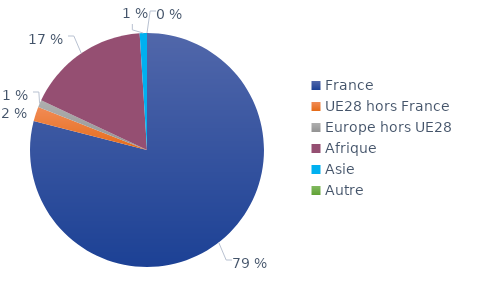
| Category | Series 0 |
|---|---|
| France | 0.79 |
| UE28 hors France | 0.02 |
| Europe hors UE28 | 0.01 |
| Afrique | 0.17 |
| Asie | 0.01 |
| Autre | 0 |